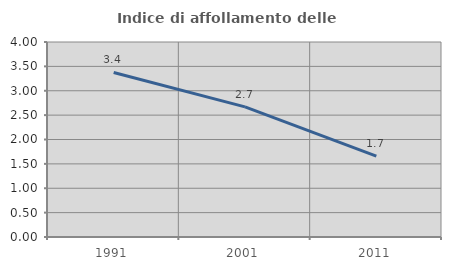
| Category | Indice di affollamento delle abitazioni  |
|---|---|
| 1991.0 | 3.374 |
| 2001.0 | 2.67 |
| 2011.0 | 1.659 |